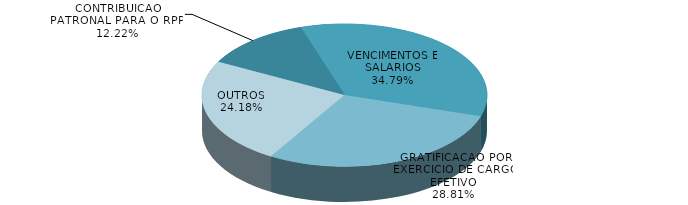
| Category | Series 0 | Series 1 |
|---|---|---|
| CONTRIBUICAO PATRONAL PARA O RPPS | 14522283.56 | 0.122 |
| VENCIMENTOS E SALARIOS | 41337693.5 | 0.348 |
| GRATIFICACAO POR EXERCICIO DE CARGO EFETIVO | 34237206.77 | 0.288 |
| OUTROS | 28737481.1 | 0.242 |